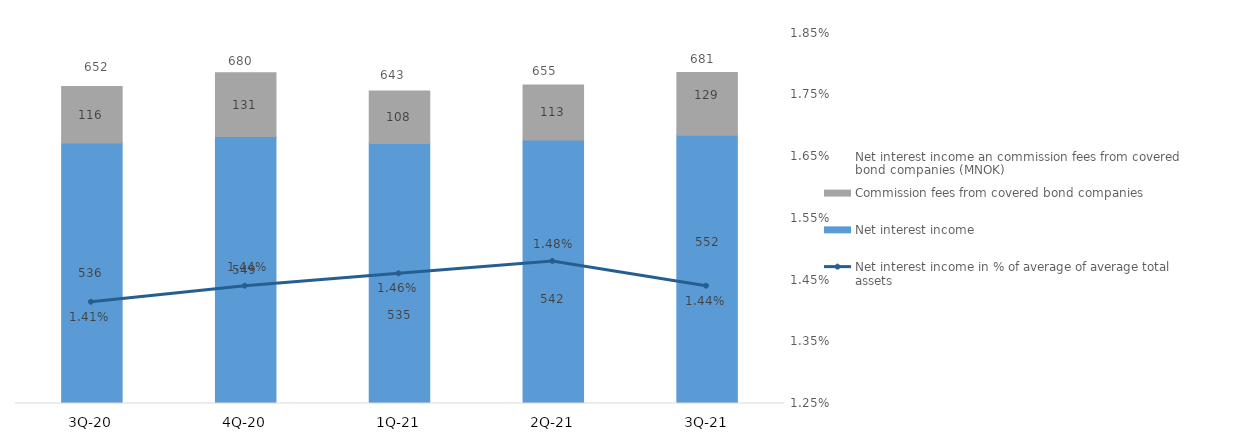
| Category | Net interest income | Commission fees from covered bond companies |
|---|---|---|
| 3Q-21 | 551.624 | 129.121 |
| 2Q-21 | 541.898 | 113.288 |
| 1Q-21 | 534.886 | 107.955 |
| 4Q-20 | 549.138 | 131.015 |
| 3Q-20 | 535.786 | 116.034 |